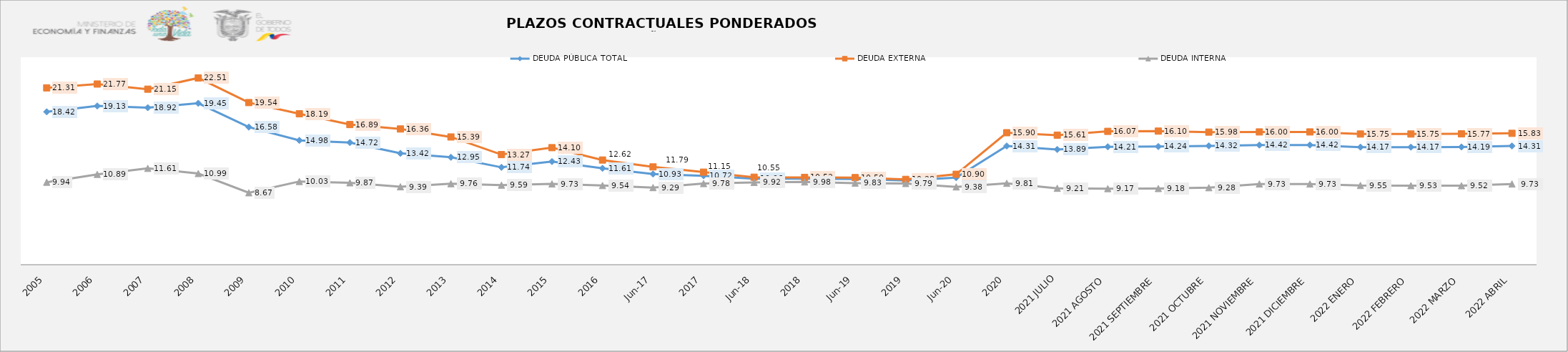
| Category | DEUDA PÚBLICA TOTAL | DEUDA EXTERNA  | DEUDA INTERNA |
|---|---|---|---|
| 2005 | 18.42 | 21.31 | 9.94 |
| 2006 | 19.13 | 21.77 | 10.89 |
| 2007 | 18.92 | 21.15 | 11.61 |
| 2008 | 19.45 | 22.505 | 10.99 |
| 2009 | 16.58 | 19.536 | 8.67 |
| 2010 | 14.98 | 18.188 | 10.03 |
| 2011 | 14.717 | 16.89 | 9.87 |
| 2012 | 13.423 | 16.356 | 9.39 |
| 2013 | 12.946 | 15.393 | 9.76 |
| 2014 | 11.737 | 13.27 | 9.59 |
| 2015 | 12.43 | 14.105 | 9.734 |
| 2016 | 11.611 | 12.616 | 9.541 |
| jun-17 | 10.928 | 11.786 | 9.294 |
| 2017 | 10.717 | 11.155 | 9.776 |
| jun-18 | 10.364 | 10.547 | 9.919 |
| 2018 | 10.371 | 10.522 | 9.976 |
| jun-19 | 10.321 | 10.498 | 9.835 |
| 2019 | 10.156 | 10.284 | 9.786 |
| jun-20 | 10.488 | 10.898 | 9.379 |
| 2020 | 14.309 | 15.905 | 9.812 |
| 2021 JULIO | 13.89 | 15.614 | 9.21 |
| 2021 AGOSTO | 14.21 | 16.07 | 9.17 |
| 2021 SEPTIEMBRE | 14.24 | 16.1 | 9.18 |
| 2021 OCTUBRE | 14.32 | 15.98 | 9.28 |
| 2021 NOVIEMBRE | 14.42 | 16 | 9.73 |
| 2021 DICIEMBRE | 14.42 | 16 | 9.73 |
| 2022 ENERO | 14.17 | 15.75 | 9.55 |
| 2022 FEBRERO | 14.17 | 15.75 | 9.53 |
| 2022 MARZO | 14.19 | 15.77 | 9.52 |
| 2022 ABRIL | 14.31 | 15.83 | 9.73 |